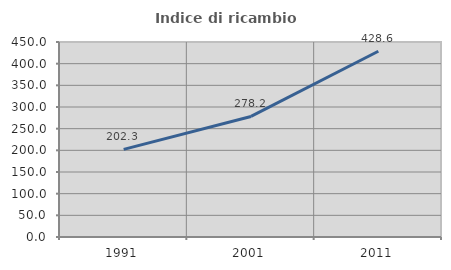
| Category | Indice di ricambio occupazionale  |
|---|---|
| 1991.0 | 202.299 |
| 2001.0 | 278.199 |
| 2011.0 | 428.571 |